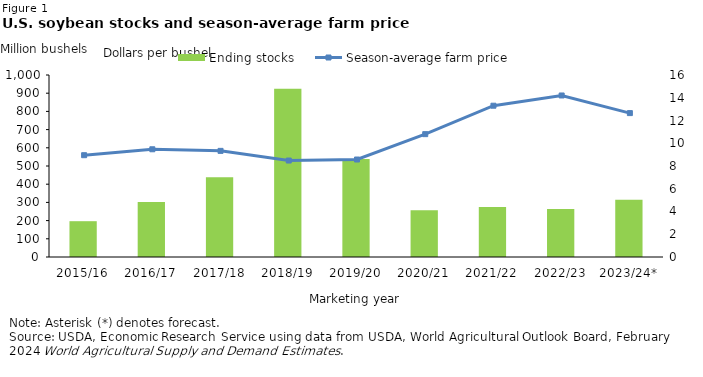
| Category | Ending stocks |
|---|---|
| 2015/16 | 196.729 |
| 2016/17 | 301.595 |
| 2017/18 | 438.105 |
| 2018/19 | 925.052 |
| 2019/20 | 538.541 |
| 2020/21 | 256.979 |
| 2021/22 | 274.394 |
| 2022/23 | 264.184 |
| 2023/24* | 314.946 |